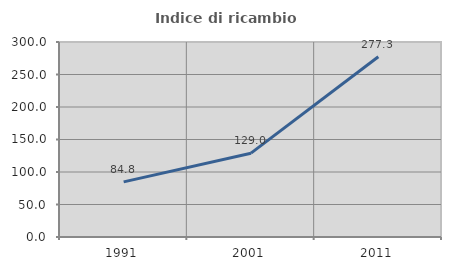
| Category | Indice di ricambio occupazionale  |
|---|---|
| 1991.0 | 84.751 |
| 2001.0 | 128.972 |
| 2011.0 | 277.297 |